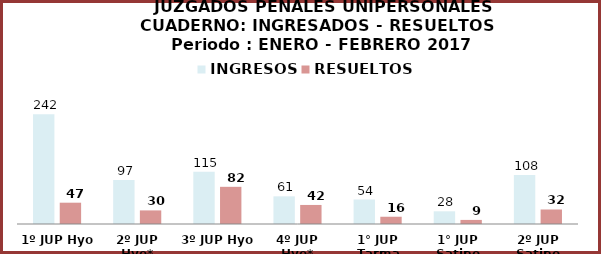
| Category | INGRESOS | RESUELTOS |
|---|---|---|
| 1º JUP Hyo | 242 | 47 |
| 2º JUP Hyo* | 97 | 30 |
| 3º JUP Hyo | 115 | 82 |
| 4º JUP Hyo* | 61 | 42 |
| 1° JUP Tarma | 54 | 16 |
| 1° JUP Satipo | 28 | 9 |
| 2º JUP Satipo | 108 | 32 |